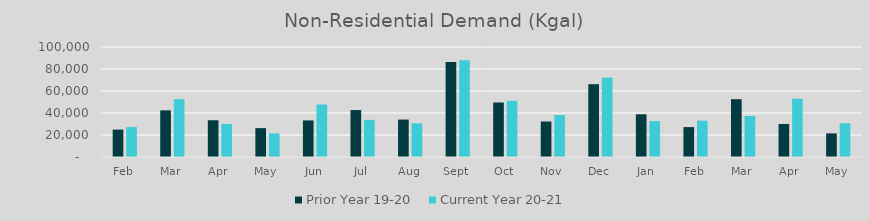
| Category | Prior Year 19-20  | Current Year 20-21 |
|---|---|---|
| Feb | 24891.705 | 27184.287 |
| Mar | 42416.796 | 52556.784 |
| Apr | 33427.881 | 30008.586 |
| May | 26254.448 | 21459.484 |
| Jun | 33248.873 | 47687.401 |
| Jul | 42679.938 | 33702.696 |
| Aug | 34036.498 | 30630.765 |
| Sep | 86367.775 | 87939.966 |
| Oct | 49561.754 | 51017.647 |
| Nov | 32261.42 | 38090.247 |
| Dec | 66164.871 | 72201.815 |
| Jan | 38851.995 | 32645.301 |
| Feb | 27184.287 | 32987.653 |
| Mar | 52556.784 | 37296.185 |
| Apr | 30008.586 | 52983.593 |
| May | 21459.484 | 30657.737 |